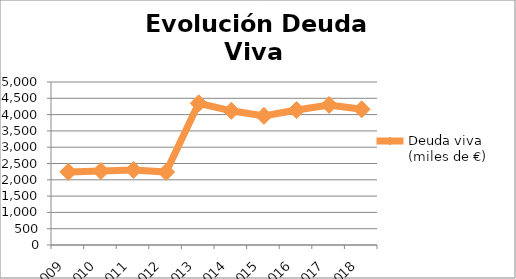
| Category | Deuda viva (miles de €) |
|---|---|
| 2009.0 | 2243 |
| 2010.0 | 2268 |
| 2011.0 | 2301 |
| 2012.0 | 2237 |
| 2013.0 | 4345.452 |
| 2014.0 | 4116.124 |
| 2015.0 | 3961 |
| 2016.0 | 4139.092 |
| 2017.0 | 4296.86 |
| 2018.0 | 4163 |